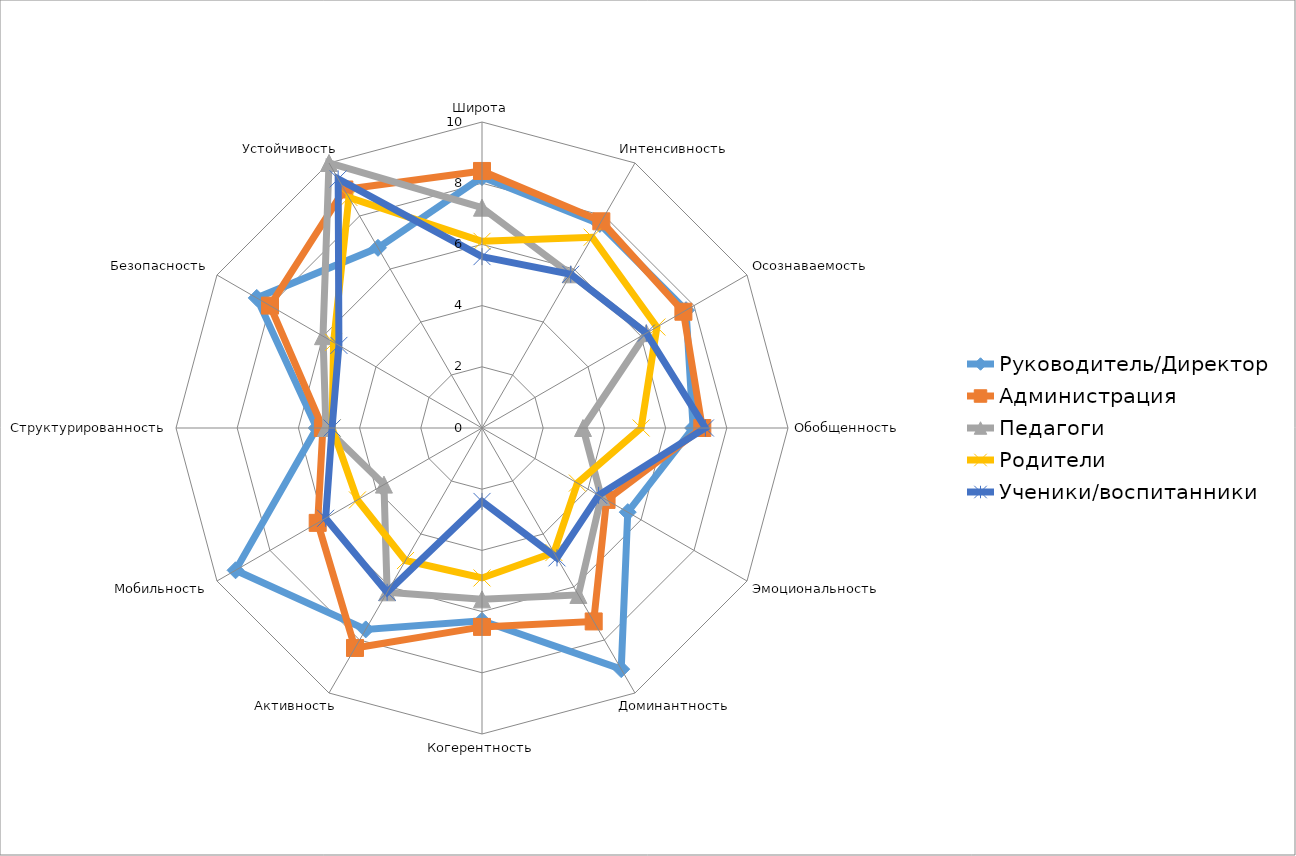
| Category | Руководитель/Директор | Администрация | Педагоги | Родители | Ученики/воспитанники |
|---|---|---|---|---|---|
| Широта | 8.2 | 8.4 | 7.2 | 6.1 | 5.6 |
| Интенсивность | 7.7 | 7.8 | 5.8 | 7.2 | 5.8 |
| Осознаваемость | 7.7 | 7.6 | 6.2 | 6.6 | 6.2 |
| Обобщенность | 6.9 | 7.2 | 3.3 | 5.2 | 7.3 |
| Эмоциональность | 5.5 | 4.7 | 4.5 | 3.6 | 4.4 |
| Доминантность | 9.1 | 7.3 | 6.3 | 4.7 | 4.9 |
| Когерентность | 6.3 | 6.5 | 5.6 | 4.9 | 2.4 |
| Активность | 7.6 | 8.3 | 6.2 | 5 | 6.2 |
| Мобильность | 9.3 | 6.2 | 3.7 | 4.7 | 5.9 |
| Структурированность | 5.4 | 5.2 | 5.1 | 4.9 | 4.9 |
| Безопасность | 8.5 | 8 | 6 | 5.6 | 5.4 |
| Устойчивость | 6.8 | 9 | 10 | 8.7 | 9.4 |